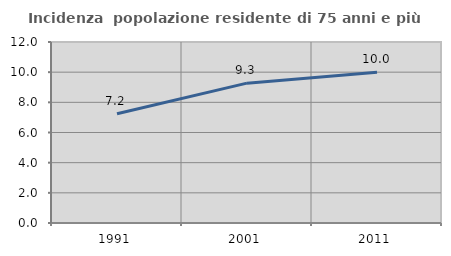
| Category | Incidenza  popolazione residente di 75 anni e più |
|---|---|
| 1991.0 | 7.241 |
| 2001.0 | 9.272 |
| 2011.0 | 9.996 |